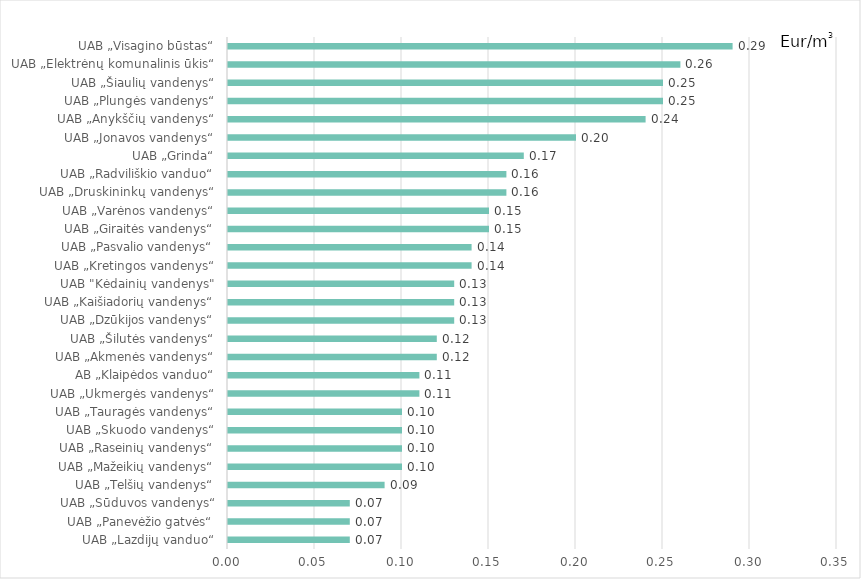
| Category | Eur/m3
(be PVM) |
|---|---|
| UAB „Lazdijų vanduo“ | 0.07 |
| UAB „Panevėžio gatvės“ | 0.07 |
| UAB „Sūduvos vandenys“ | 0.07 |
| UAB „Telšių vandenys“ | 0.09 |
| UAB „Mažeikių vandenys“ | 0.1 |
| UAB „Raseinių vandenys“ | 0.1 |
| UAB „Skuodo vandenys“ | 0.1 |
| UAB „Tauragės vandenys“ | 0.1 |
| UAB „Ukmergės vandenys“ | 0.11 |
| AB „Klaipėdos vanduo“ | 0.11 |
| UAB „Akmenės vandenys“ | 0.12 |
| UAB „Šilutės vandenys“ | 0.12 |
| UAB „Dzūkijos vandenys“ | 0.13 |
| UAB „Kaišiadorių vandenys“ | 0.13 |
| UAB "Kėdainių vandenys" | 0.13 |
| UAB „Kretingos vandenys“ | 0.14 |
| UAB „Pasvalio vandenys“ | 0.14 |
| UAB „Giraitės vandenys“ | 0.15 |
| UAB „Varėnos vandenys“ | 0.15 |
| UAB „Druskininkų vandenys“ | 0.16 |
| UAB „Radviliškio vanduo“ | 0.16 |
| UAB „Grinda“ | 0.17 |
| UAB „Jonavos vandenys“ | 0.2 |
| UAB „Anykščių vandenys“ | 0.24 |
| UAB „Plungės vandenys“ | 0.25 |
| UAB „Šiaulių vandenys“ | 0.25 |
| UAB „Elektrėnų komunalinis ūkis“ | 0.26 |
| UAB „Visagino būstas“ | 0.29 |